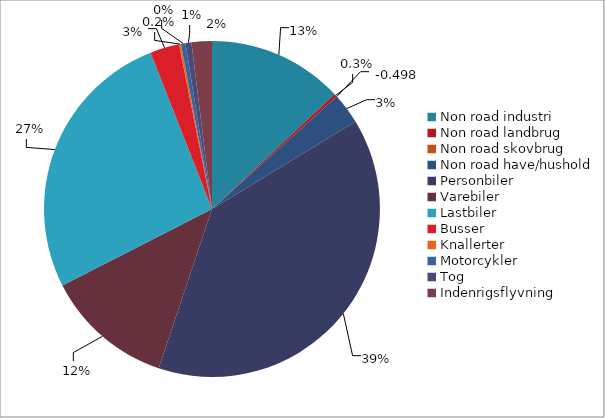
| Category | Series 0 |
|---|---|
| Non road industri | 9057.39 |
| Non road landbrug | 211.86 |
| Non road skovbrug | 1.08 |
| Non road have/hushold | 2058.94 |
| Personbiler | 27027 |
| Varebiler | 8580 |
| Lastbiler | 18480 |
| Busser | 1956 |
| Knallerter | 127.28 |
| Motorcykler | 304.41 |
| Tog | 397.698 |
| Indenrigsflyvning | 1359.5 |